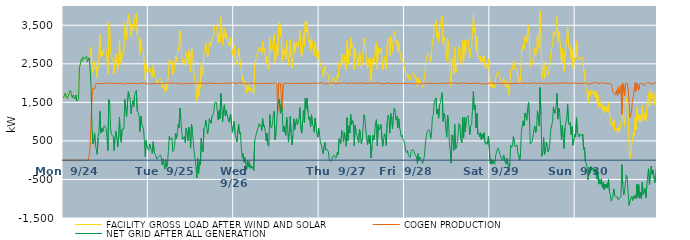
| Category | FACILITY GROSS LOAD AFTER WIND AND SOLAR | COGEN PRODUCTION | NET GRID AFTER ALL GENERATION |
|---|---|---|---|
|  Mon  9/24 | 1614 | 0 | 1614 |
|  Mon  9/24 | 1599 | 0 | 1599 |
|  Mon  9/24 | 1739 | 0 | 1739 |
|  Mon  9/24 | 1758 | 0 | 1758 |
|  Mon  9/24 | 1595 | 0 | 1595 |
|  Mon  9/24 | 1632 | 0 | 1632 |
|  Mon  9/24 | 1693 | 0 | 1693 |
|  Mon  9/24 | 1791 | 0 | 1791 |
|  Mon  9/24 | 1817 | 0 | 1817 |
|  Mon  9/24 | 1696 | 0 | 1696 |
|  Mon  9/24 | 1618 | 0 | 1618 |
|  Mon  9/24 | 1694 | 0 | 1694 |
|  Mon  9/24 | 1620 | 0 | 1620 |
|  Mon  9/24 | 1584 | 0 | 1584 |
|  Mon  9/24 | 1694 | 0 | 1694 |
|  Mon  9/24 | 1541 | 0 | 1541 |
|  Mon  9/24 | 1548 | 0 | 1548 |
|  Mon  9/24 | 1578 | 0 | 1578 |
|  Mon  9/24 | 2393 | 0 | 2393 |
|  Mon  9/24 | 2500 | 0 | 2500 |
|  Mon  9/24 | 2613 | 0 | 2613 |
|  Mon  9/24 | 2571 | 0 | 2571 |
|  Mon  9/24 | 2683 | 0 | 2683 |
|  Mon  9/24 | 2637 | 0 | 2637 |
|  Mon  9/24 | 2647 | 0 | 2647 |
|  Mon  9/24 | 2645 | 0 | 2645 |
|  Mon  9/24 | 2699 | 0 | 2699 |
|  Mon  9/24 | 2556 | 0 | 2556 |
|  Mon  9/24 | 2619 | 0 | 2619 |
|  Mon  9/24 | 2661 | 0 | 2661 |
|  Mon  9/24 | 2698 | 312 | 2386 |
|  Mon  9/24 | 2935 | 1019 | 1916 |
|  Mon  9/24 | 2478 | 1504 | 974 |
|  Mon  9/24 | 2279 | 1859 | 420 |
|  Mon  9/24 | 2424 | 1867 | 557 |
|  Mon  9/24 | 2553 | 1844 | 709 |
|  Mon  9/24 | 2377 | 1979 | 398 |
|  Mon  9/24 | 2426 | 2003 | 423 |
|  Mon  9/24 | 2143 | 1991 | 152 |
|  Mon  9/24 | 2583 | 1994 | 589 |
|  Mon  9/24 | 2735 | 1982 | 753 |
|  Mon  9/24 | 3267 | 1999 | 1268 |
|  Mon  9/24 | 2685 | 1983 | 702 |
|  Mon  9/24 | 2835 | 2002 | 833 |
|  Mon  9/24 | 2718 | 1985 | 733 |
|  Mon  9/24 | 2834 | 2009 | 825 |
|  Mon  9/24 | 2885 | 1989 | 896 |
|  Mon  9/24 | 2873 | 2010 | 863 |
|  Mon  9/24 | 2833 | 2008 | 825 |
|  Mon  9/24 | 2588 | 2001 | 587 |
|  Mon  9/24 | 2250 | 2002 | 248 |
|  Mon  9/24 | 3567 | 1993 | 1574 |
|  Mon  9/24 | 3489 | 1986 | 1503 |
|  Mon  9/24 | 2806 | 1990 | 816 |
|  Mon  9/24 | 2679 | 1998 | 681 |
|  Mon  9/24 | 2648 | 2007 | 641 |
|  Mon  9/24 | 2593 | 1985 | 608 |
|  Mon  9/24 | 2240 | 1990 | 250 |
|  Mon  9/24 | 2600 | 1994 | 606 |
|  Mon  9/24 | 2754 | 2005 | 749 |
|  Mon  9/24 | 2574 | 1995 | 579 |
|  Mon  9/24 | 2337 | 1998 | 339 |
|  Mon  9/24 | 2602 | 1986 | 616 |
|  Mon  9/24 | 3117 | 1995 | 1122 |
|  Mon  9/24 | 2581 | 2000 | 581 |
|  Mon  9/24 | 2470 | 2005 | 465 |
|  Mon  9/24 | 2786 | 1984 | 802 |
|  Mon  9/24 | 2794 | 1990 | 804 |
|  Mon  9/24 | 2778 | 1970 | 808 |
|  Mon  9/24 | 3570 | 1988 | 1582 |
|  Mon  9/24 | 3306 | 1997 | 1309 |
|  Mon  9/24 | 3129 | 1996 | 1133 |
|  Mon  9/24 | 3122 | 1994 | 1128 |
|  Mon  9/24 | 3785 | 2007 | 1778 |
|  Mon  9/24 | 3644 | 1988 | 1656 |
|  Mon  9/24 | 3600 | 1989 | 1611 |
|  Mon  9/24 | 3202 | 1997 | 1205 |
|  Mon  9/24 | 3429 | 2015 | 1414 |
|  Mon  9/24 | 3525 | 1986 | 1539 |
|  Mon  9/24 | 3372 | 1984 | 1388 |
|  Mon  9/24 | 3673 | 1989 | 1684 |
|  Mon  9/24 | 3737 | 1977 | 1760 |
|  Mon  9/24 | 3802 | 1992 | 1810 |
|  Mon  9/24 | 3257 | 1985 | 1272 |
|  Mon  9/24 | 3214 | 1978 | 1236 |
|  Mon  9/24 | 3147 | 1983 | 1164 |
|  Mon  9/24 | 2735 | 1994 | 741 |
|  Mon  9/24 | 3142 | 1998 | 1144 |
|  Mon  9/24 | 2928 | 1994 | 934 |
|  Mon  9/24 | 2951 | 1996 | 955 |
|  Mon  9/24 | 2817 | 2005 | 812 |
|  Mon  9/24 | 2507 | 1997 | 510 |
|  Mon  9/24 | 2082 | 1988 | 94 |
|  Mon  9/24 | 2493 | 1983 | 510 |
|  Mon  9/24 | 2326 | 1977 | 349 |
|  Mon  9/24 | 2270 | 1976 | 294 |
|  Tue  9/25 | 2253 | 1999 | 254 |
|  Tue  9/25 | 2418 | 1999 | 419 |
|  Tue  9/25 | 2293 | 1968 | 325 |
|  Tue  9/25 | 2255 | 1983 | 272 |
|  Tue  9/25 | 2162 | 1990 | 172 |
|  Tue  9/25 | 2464 | 1987 | 477 |
|  Tue  9/25 | 2213 | 1992 | 221 |
|  Tue  9/25 | 2149 | 1998 | 151 |
|  Tue  9/25 | 2100 | 1991 | 109 |
|  Tue  9/25 | 2010 | 1984 | 26 |
|  Tue  9/25 | 2016 | 1985 | 31 |
|  Tue  9/25 | 2070 | 1982 | 88 |
|  Tue  9/25 | 2072 | 1981 | 91 |
|  Tue  9/25 | 2122 | 1988 | 134 |
|  Tue  9/25 | 2059 | 1979 | 80 |
|  Tue  9/25 | 1875 | 2003 | -128 |
|  Tue  9/25 | 2025 | 1992 | 33 |
|  Tue  9/25 | 1911 | 2005 | -94 |
|  Tue  9/25 | 1763 | 1994 | -231 |
|  Tue  9/25 | 1989 | 1977 | 12 |
|  Tue  9/25 | 1820 | 2001 | -181 |
|  Tue  9/25 | 1883 | 1989 | -106 |
|  Tue  9/25 | 2233 | 2004 | 229 |
|  Tue  9/25 | 2627 | 2011 | 616 |
|  Tue  9/25 | 2522 | 1996 | 526 |
|  Tue  9/25 | 2495 | 1975 | 520 |
|  Tue  9/25 | 2587 | 1997 | 590 |
|  Tue  9/25 | 2227 | 2003 | 224 |
|  Tue  9/25 | 2256 | 1990 | 266 |
|  Tue  9/25 | 2371 | 2002 | 369 |
|  Tue  9/25 | 2719 | 2015 | 704 |
|  Tue  9/25 | 2557 | 1989 | 568 |
|  Tue  9/25 | 2672 | 1986 | 686 |
|  Tue  9/25 | 2920 | 1993 | 927 |
|  Tue  9/25 | 2837 | 2000 | 837 |
|  Tue  9/25 | 3354 | 2006 | 1348 |
|  Tue  9/25 | 3094 | 2007 | 1087 |
|  Tue  9/25 | 2715 | 1977 | 738 |
|  Tue  9/25 | 2524 | 1995 | 529 |
|  Tue  9/25 | 2519 | 1978 | 541 |
|  Tue  9/25 | 2622 | 2006 | 616 |
|  Tue  9/25 | 2448 | 1990 | 458 |
|  Tue  9/25 | 2806 | 1973 | 833 |
|  Tue  9/25 | 2734 | 1994 | 740 |
|  Tue  9/25 | 2494 | 1991 | 503 |
|  Tue  9/25 | 2860 | 2003 | 857 |
|  Tue  9/25 | 2673 | 1995 | 678 |
|  Tue  9/25 | 2299 | 1990 | 309 |
|  Tue  9/25 | 2919 | 1987 | 932 |
|  Tue  9/25 | 2781 | 1996 | 785 |
|  Tue  9/25 | 2461 | 1991 | 470 |
|  Tue  9/25 | 2216 | 1999 | 217 |
|  Tue  9/25 | 2035 | 1990 | 45 |
|  Tue  9/25 | 1831 | 1995 | -164 |
|  Tue  9/25 | 1540 | 2000 | -460 |
|  Tue  9/25 | 2046 | 1999 | 47 |
|  Tue  9/25 | 1645 | 1994 | -349 |
|  Tue  9/25 | 1964 | 1999 | -35 |
|  Tue  9/25 | 1866 | 1992 | -126 |
|  Tue  9/25 | 2548 | 1973 | 575 |
|  Tue  9/25 | 2270 | 2001 | 269 |
|  Tue  9/25 | 2228 | 2006 | 222 |
|  Tue  9/25 | 2807 | 1981 | 826 |
|  Tue  9/25 | 2864 | 2008 | 856 |
|  Tue  9/25 | 3046 | 2007 | 1039 |
|  Tue  9/25 | 2843 | 1959 | 884 |
|  Tue  9/25 | 2681 | 2002 | 679 |
|  Tue  9/25 | 2812 | 2008 | 804 |
|  Tue  9/25 | 3079 | 2005 | 1074 |
|  Tue  9/25 | 3088 | 1990 | 1098 |
|  Tue  9/25 | 2954 | 1997 | 957 |
|  Tue  9/25 | 3143 | 2011 | 1132 |
|  Tue  9/25 | 3167 | 1989 | 1178 |
|  Tue  9/25 | 3228 | 2000 | 1228 |
|  Tue  9/25 | 3475 | 1990 | 1485 |
|  Tue  9/25 | 3494 | 1988 | 1506 |
|  Tue  9/25 | 3491 | 1988 | 1503 |
|  Tue  9/25 | 3266 | 1992 | 1274 |
|  Tue  9/25 | 3037 | 1992 | 1045 |
|  Tue  9/25 | 3283 | 1997 | 1286 |
|  Tue  9/25 | 3066 | 1988 | 1078 |
|  Tue  9/25 | 3713 | 1986 | 1727 |
|  Tue  9/25 | 3378 | 1991 | 1387 |
|  Tue  9/25 | 2978 | 1981 | 997 |
|  Tue  9/25 | 3307 | 1985 | 1322 |
|  Tue  9/25 | 3427 | 1990 | 1437 |
|  Tue  9/25 | 3160 | 2003 | 1157 |
|  Tue  9/25 | 3288 | 1999 | 1289 |
|  Tue  9/25 | 3150 | 1983 | 1167 |
|  Tue  9/25 | 3166 | 2010 | 1156 |
|  Tue  9/25 | 2968 | 1981 | 987 |
|  Tue  9/25 | 3099 | 1970 | 1129 |
|  Tue  9/25 | 3183 | 1997 | 1186 |
|  Tue  9/25 | 2917 | 1996 | 921 |
|  Tue  9/25 | 2740 | 2017 | 723 |
|  Tue  9/25 | 2890 | 1995 | 895 |
|  Wed  9/26 | 2995 | 1990 | 1005 |
|  Wed  9/26 | 2664 | 1994 | 670 |
|  Wed  9/26 | 2583 | 1997 | 586 |
|  Wed  9/26 | 2467 | 1995 | 472 |
|  Wed  9/26 | 2474 | 1992 | 482 |
|  Wed  9/26 | 2911 | 1983 | 928 |
|  Wed  9/26 | 2706 | 2015 | 691 |
|  Wed  9/26 | 2724 | 2004 | 720 |
|  Wed  9/26 | 2339 | 2002 | 337 |
|  Wed  9/26 | 2069 | 1998 | 71 |
|  Wed  9/26 | 2171 | 2003 | 168 |
|  Wed  9/26 | 1938 | 1992 | -54 |
|  Wed  9/26 | 2056 | 1986 | 70 |
|  Wed  9/26 | 1908 | 2004 | -96 |
|  Wed  9/26 | 1736 | 1988 | -252 |
|  Wed  9/26 | 1987 | 1997 | -10 |
|  Wed  9/26 | 1794 | 1969 | -175 |
|  Wed  9/26 | 1959 | 1993 | -34 |
|  Wed  9/26 | 1793 | 2001 | -208 |
|  Wed  9/26 | 1867 | 2007 | -140 |
|  Wed  9/26 | 1782 | 1995 | -213 |
|  Wed  9/26 | 1811 | 1981 | -170 |
|  Wed  9/26 | 1723 | 2000 | -277 |
|  Wed  9/26 | 2497 | 2002 | 495 |
|  Wed  9/26 | 2576 | 1985 | 591 |
|  Wed  9/26 | 2700 | 1998 | 702 |
|  Wed  9/26 | 2755 | 1982 | 773 |
|  Wed  9/26 | 2777 | 1981 | 796 |
|  Wed  9/26 | 2937 | 1993 | 944 |
|  Wed  9/26 | 2885 | 2001 | 884 |
|  Wed  9/26 | 2899 | 1986 | 913 |
|  Wed  9/26 | 2749 | 1980 | 769 |
|  Wed  9/26 | 3075 | 1994 | 1081 |
|  Wed  9/26 | 2851 | 1989 | 862 |
|  Wed  9/26 | 2904 | 2005 | 899 |
|  Wed  9/26 | 2706 | 1977 | 729 |
|  Wed  9/26 | 2507 | 2007 | 500 |
|  Wed  9/26 | 2688 | 1989 | 699 |
|  Wed  9/26 | 2383 | 1986 | 397 |
|  Wed  9/26 | 2349 | 1993 | 356 |
|  Wed  9/26 | 3180 | 1999 | 1181 |
|  Wed  9/26 | 2895 | 2001 | 894 |
|  Wed  9/26 | 2816 | 1982 | 834 |
|  Wed  9/26 | 2943 | 1999 | 944 |
|  Wed  9/26 | 3162 | 2003 | 1159 |
|  Wed  9/26 | 3274 | 2007 | 1267 |
|  Wed  9/26 | 2530 | 2002 | 528 |
|  Wed  9/26 | 2671 | 1990 | 681 |
|  Wed  9/26 | 2996 | 1978 | 1018 |
|  Wed  9/26 | 2700 | 1260 | 1440 |
|  Wed  9/26 | 3520 | 1995 | 1525 |
|  Wed  9/26 | 3580 | 1993 | 1587 |
|  Wed  9/26 | 3209 | 1994 | 1215 |
|  Wed  9/26 | 3448 | 2008 | 1440 |
|  Wed  9/26 | 2548 | 1288 | 1260 |
|  Wed  9/26 | 2723 | 1979 | 744 |
|  Wed  9/26 | 2888 | 1999 | 889 |
|  Wed  9/26 | 2724 | 1991 | 733 |
|  Wed  9/26 | 2616 | 1976 | 640 |
|  Wed  9/26 | 3109 | 1998 | 1111 |
|  Wed  9/26 | 2930 | 1999 | 931 |
|  Wed  9/26 | 2452 | 1983 | 469 |
|  Wed  9/26 | 2725 | 2009 | 716 |
|  Wed  9/26 | 3131 | 1998 | 1133 |
|  Wed  9/26 | 2686 | 1983 | 703 |
|  Wed  9/26 | 2394 | 2001 | 393 |
|  Wed  9/26 | 2632 | 1984 | 648 |
|  Wed  9/26 | 3065 | 1990 | 1075 |
|  Wed  9/26 | 2771 | 1992 | 779 |
|  Wed  9/26 | 2963 | 2002 | 961 |
|  Wed  9/26 | 3069 | 1994 | 1075 |
|  Wed  9/26 | 2913 | 1990 | 923 |
|  Wed  9/26 | 2959 | 1988 | 971 |
|  Wed  9/26 | 3088 | 1991 | 1097 |
|  Wed  9/26 | 3366 | 2004 | 1362 |
|  Wed  9/26 | 2792 | 1985 | 807 |
|  Wed  9/26 | 2685 | 1986 | 699 |
|  Wed  9/26 | 2996 | 1990 | 1006 |
|  Wed  9/26 | 3292 | 1997 | 1295 |
|  Wed  9/26 | 2954 | 1981 | 973 |
|  Wed  9/26 | 3597 | 1987 | 1610 |
|  Wed  9/26 | 3327 | 1983 | 1344 |
|  Wed  9/26 | 3600 | 1997 | 1603 |
|  Wed  9/26 | 3263 | 2007 | 1256 |
|  Wed  9/26 | 3060 | 2002 | 1058 |
|  Wed  9/26 | 3110 | 1989 | 1121 |
|  Wed  9/26 | 2843 | 1978 | 865 |
|  Wed  9/26 | 3175 | 1995 | 1180 |
|  Wed  9/26 | 2942 | 2007 | 935 |
|  Wed  9/26 | 2864 | 1995 | 869 |
|  Wed  9/26 | 2716 | 1994 | 722 |
|  Wed  9/26 | 3077 | 1985 | 1092 |
|  Wed  9/26 | 2880 | 1987 | 893 |
|  Wed  9/26 | 2679 | 1987 | 692 |
|  Wed  9/26 | 2590 | 1998 | 592 |
|  Wed  9/26 | 2824 | 2001 | 823 |
|  Thu  9/27 | 2666 | 1994 | 672 |
|  Thu  9/27 | 2429 | 1981 | 448 |
|  Thu  9/27 | 2408 | 2012 | 396 |
|  Thu  9/27 | 2379 | 1990 | 389 |
|  Thu  9/27 | 2167 | 1997 | 170 |
|  Thu  9/27 | 2346 | 1991 | 355 |
|  Thu  9/27 | 2436 | 1971 | 465 |
|  Thu  9/27 | 2255 | 1994 | 261 |
|  Thu  9/27 | 2283 | 1994 | 289 |
|  Thu  9/27 | 2257 | 1997 | 260 |
|  Thu  9/27 | 2195 | 1983 | 212 |
|  Thu  9/27 | 2001 | 2007 | -6 |
|  Thu  9/27 | 2001 | 2002 | -1 |
|  Thu  9/27 | 1951 | 1977 | -26 |
|  Thu  9/27 | 2026 | 1992 | 34 |
|  Thu  9/27 | 2114 | 2003 | 111 |
|  Thu  9/27 | 2096 | 2002 | 94 |
|  Thu  9/27 | 2125 | 2002 | 123 |
|  Thu  9/27 | 2024 | 1977 | 47 |
|  Thu  9/27 | 2051 | 1976 | 75 |
|  Thu  9/27 | 2201 | 1995 | 206 |
|  Thu  9/27 | 2145 | 2007 | 138 |
|  Thu  9/27 | 2552 | 1998 | 554 |
|  Thu  9/27 | 2464 | 1974 | 490 |
|  Thu  9/27 | 2426 | 1988 | 438 |
|  Thu  9/27 | 2759 | 1988 | 771 |
|  Thu  9/27 | 2750 | 2007 | 743 |
|  Thu  9/27 | 2469 | 1998 | 471 |
|  Thu  9/27 | 2729 | 2013 | 716 |
|  Thu  9/27 | 2594 | 2004 | 590 |
|  Thu  9/27 | 2349 | 1989 | 360 |
|  Thu  9/27 | 3101 | 2000 | 1101 |
|  Thu  9/27 | 2490 | 1987 | 503 |
|  Thu  9/27 | 2877 | 1984 | 893 |
|  Thu  9/27 | 2709 | 2007 | 702 |
|  Thu  9/27 | 3178 | 1993 | 1185 |
|  Thu  9/27 | 2912 | 1994 | 918 |
|  Thu  9/27 | 3019 | 1990 | 1029 |
|  Thu  9/27 | 2984 | 1993 | 991 |
|  Thu  9/27 | 2352 | 1981 | 371 |
|  Thu  9/27 | 2900 | 1991 | 909 |
|  Thu  9/27 | 2759 | 1992 | 767 |
|  Thu  9/27 | 2657 | 2009 | 648 |
|  Thu  9/27 | 2659 | 2005 | 654 |
|  Thu  9/27 | 2443 | 1991 | 452 |
|  Thu  9/27 | 2814 | 2008 | 806 |
|  Thu  9/27 | 2646 | 2004 | 642 |
|  Thu  9/27 | 2408 | 1986 | 422 |
|  Thu  9/27 | 2560 | 2004 | 556 |
|  Thu  9/27 | 2834 | 1992 | 842 |
|  Thu  9/27 | 3164 | 1988 | 1176 |
|  Thu  9/27 | 3067 | 1994 | 1073 |
|  Thu  9/27 | 2796 | 1996 | 800 |
|  Thu  9/27 | 2537 | 1982 | 555 |
|  Thu  9/27 | 2380 | 1987 | 393 |
|  Thu  9/27 | 2638 | 1993 | 645 |
|  Thu  9/27 | 2437 | 1999 | 438 |
|  Thu  9/27 | 2630 | 1991 | 639 |
|  Thu  9/27 | 2057 | 2000 | 57 |
|  Thu  9/27 | 2378 | 1999 | 379 |
|  Thu  9/27 | 2644 | 2001 | 643 |
|  Thu  9/27 | 2524 | 2004 | 520 |
|  Thu  9/27 | 2701 | 1994 | 707 |
|  Thu  9/27 | 2960 | 1996 | 964 |
|  Thu  9/27 | 3054 | 2004 | 1050 |
|  Thu  9/27 | 2364 | 1995 | 369 |
|  Thu  9/27 | 2926 | 2006 | 920 |
|  Thu  9/27 | 2790 | 1997 | 793 |
|  Thu  9/27 | 2817 | 1983 | 834 |
|  Thu  9/27 | 2910 | 1980 | 930 |
|  Thu  9/27 | 2907 | 1984 | 923 |
|  Thu  9/27 | 2350 | 1988 | 362 |
|  Thu  9/27 | 2501 | 1991 | 510 |
|  Thu  9/27 | 2685 | 1999 | 686 |
|  Thu  9/27 | 2603 | 1978 | 625 |
|  Thu  9/27 | 2376 | 1994 | 382 |
|  Thu  9/27 | 2966 | 2002 | 964 |
|  Thu  9/27 | 3148 | 1985 | 1163 |
|  Thu  9/27 | 3105 | 2003 | 1102 |
|  Thu  9/27 | 2700 | 2000 | 700 |
|  Thu  9/27 | 3210 | 1988 | 1222 |
|  Thu  9/27 | 3056 | 1993 | 1063 |
|  Thu  9/27 | 2797 | 1987 | 810 |
|  Thu  9/27 | 3130 | 1990 | 1140 |
|  Thu  9/27 | 3344 | 1988 | 1356 |
|  Thu  9/27 | 3246 | 1992 | 1254 |
|  Thu  9/27 | 3033 | 1982 | 1051 |
|  Thu  9/27 | 3124 | 1983 | 1141 |
|  Thu  9/27 | 2826 | 1990 | 836 |
|  Thu  9/27 | 3062 | 1987 | 1075 |
|  Thu  9/27 | 2860 | 2002 | 858 |
|  Thu  9/27 | 2839 | 1976 | 863 |
|  Thu  9/27 | 2595 | 1984 | 611 |
|  Thu  9/27 | 2633 | 1983 | 650 |
|  Thu  9/27 | 2520 | 1994 | 526 |
|  Thu  9/27 | 2499 | 2001 | 498 |
|  Fri  9/28 | 2368 | 1976 | 392 |
|  Fri  9/28 | 2206 | 1981 | 225 |
|  Fri  9/28 | 2180 | 1985 | 195 |
|  Fri  9/28 | 2252 | 2000 | 252 |
|  Fri  9/28 | 2108 | 1993 | 115 |
|  Fri  9/28 | 2111 | 1992 | 119 |
|  Fri  9/28 | 2064 | 1991 | 73 |
|  Fri  9/28 | 2223 | 1995 | 228 |
|  Fri  9/28 | 2265 | 1992 | 273 |
|  Fri  9/28 | 2253 | 1983 | 270 |
|  Fri  9/28 | 2252 | 1993 | 259 |
|  Fri  9/28 | 2135 | 1973 | 162 |
|  Fri  9/28 | 2171 | 2004 | 167 |
|  Fri  9/28 | 2078 | 1989 | 89 |
|  Fri  9/28 | 1903 | 1990 | -87 |
|  Fri  9/28 | 2158 | 1988 | 170 |
|  Fri  9/28 | 1974 | 1976 | -2 |
|  Fri  9/28 | 2069 | 1991 | 78 |
|  Fri  9/28 | 2014 | 1988 | 26 |
|  Fri  9/28 | 2023 | 1993 | 30 |
|  Fri  9/28 | 1884 | 1971 | -87 |
|  Fri  9/28 | 2002 | 1999 | 3 |
|  Fri  9/28 | 2125 | 1993 | 132 |
|  Fri  9/28 | 2406 | 1994 | 412 |
|  Fri  9/28 | 2628 | 2018 | 610 |
|  Fri  9/28 | 2730 | 1985 | 745 |
|  Fri  9/28 | 2744 | 1990 | 754 |
|  Fri  9/28 | 2800 | 2005 | 795 |
|  Fri  9/28 | 2702 | 1972 | 730 |
|  Fri  9/28 | 2568 | 2004 | 564 |
|  Fri  9/28 | 2755 | 2009 | 746 |
|  Fri  9/28 | 3124 | 1989 | 1135 |
|  Fri  9/28 | 3175 | 2000 | 1175 |
|  Fri  9/28 | 3506 | 1982 | 1524 |
|  Fri  9/28 | 3534 | 2000 | 1534 |
|  Fri  9/28 | 3626 | 2009 | 1617 |
|  Fri  9/28 | 3178 | 1981 | 1197 |
|  Fri  9/28 | 3329 | 2006 | 1323 |
|  Fri  9/28 | 3081 | 1991 | 1090 |
|  Fri  9/28 | 3432 | 1994 | 1438 |
|  Fri  9/28 | 3501 | 2008 | 1493 |
|  Fri  9/28 | 3661 | 2003 | 1658 |
|  Fri  9/28 | 3739 | 1989 | 1750 |
|  Fri  9/28 | 3006 | 2000 | 1006 |
|  Fri  9/28 | 3198 | 1985 | 1213 |
|  Fri  9/28 | 3144 | 1991 | 1153 |
|  Fri  9/28 | 2824 | 1997 | 827 |
|  Fri  9/28 | 2572 | 1977 | 595 |
|  Fri  9/28 | 3163 | 1995 | 1168 |
|  Fri  9/28 | 2996 | 1990 | 1006 |
|  Fri  9/28 | 2461 | 2006 | 455 |
|  Fri  9/28 | 2230 | 1997 | 233 |
|  Fri  9/28 | 1922 | 2000 | -78 |
|  Fri  9/28 | 2643 | 1988 | 655 |
|  Fri  9/28 | 2562 | 1999 | 563 |
|  Fri  9/28 | 2233 | 1986 | 247 |
|  Fri  9/28 | 2937 | 2008 | 929 |
|  Fri  9/28 | 2278 | 1986 | 292 |
|  Fri  9/28 | 2324 | 1987 | 337 |
|  Fri  9/28 | 2457 | 1975 | 482 |
|  Fri  9/28 | 2709 | 1993 | 716 |
|  Fri  9/28 | 2952 | 2004 | 948 |
|  Fri  9/28 | 2858 | 1993 | 865 |
|  Fri  9/28 | 2498 | 1990 | 508 |
|  Fri  9/28 | 2464 | 2016 | 448 |
|  Fri  9/28 | 3102 | 1988 | 1114 |
|  Fri  9/28 | 2576 | 1999 | 577 |
|  Fri  9/28 | 3117 | 2000 | 1117 |
|  Fri  9/28 | 2735 | 2005 | 730 |
|  Fri  9/28 | 3091 | 2001 | 1090 |
|  Fri  9/28 | 3093 | 2003 | 1090 |
|  Fri  9/28 | 3141 | 1988 | 1153 |
|  Fri  9/28 | 2894 | 1994 | 900 |
|  Fri  9/28 | 2649 | 1986 | 663 |
|  Fri  9/28 | 2887 | 1994 | 893 |
|  Fri  9/28 | 2914 | 1991 | 923 |
|  Fri  9/28 | 3323 | 1989 | 1334 |
|  Fri  9/28 | 3782 | 2002 | 1780 |
|  Fri  9/28 | 3299 | 1996 | 1303 |
|  Fri  9/28 | 3420 | 1991 | 1429 |
|  Fri  9/28 | 2845 | 2005 | 840 |
|  Fri  9/28 | 3209 | 1997 | 1212 |
|  Fri  9/28 | 2677 | 1999 | 678 |
|  Fri  9/28 | 2706 | 1994 | 712 |
|  Fri  9/28 | 2598 | 1995 | 603 |
|  Fri  9/28 | 2698 | 1984 | 714 |
|  Fri  9/28 | 2515 | 1988 | 527 |
|  Fri  9/28 | 2646 | 1970 | 676 |
|  Fri  9/28 | 2552 | 1989 | 563 |
|  Fri  9/28 | 2706 | 1994 | 712 |
|  Fri  9/28 | 2442 | 1985 | 457 |
|  Fri  9/28 | 2382 | 1973 | 409 |
|  Fri  9/28 | 2464 | 1991 | 473 |
|  Fri  9/28 | 2406 | 1989 | 417 |
|  Fri  9/28 | 2624 | 1997 | 627 |
|  Fri  9/28 | 2641 | 1996 | 645 |
|  Sat  9/29 | 1916 | 2006 | -90 |
|  Sat  9/29 | 2034 | 2011 | 23 |
|  Sat  9/29 | 1888 | 1990 | -102 |
|  Sat  9/29 | 1995 | 1993 | 2 |
|  Sat  9/29 | 1903 | 1982 | -79 |
|  Sat  9/29 | 1869 | 1979 | -110 |
|  Sat  9/29 | 2112 | 2005 | 107 |
|  Sat  9/29 | 2203 | 2000 | 203 |
|  Sat  9/29 | 2275 | 1996 | 279 |
|  Sat  9/29 | 2305 | 1990 | 315 |
|  Sat  9/29 | 2207 | 1991 | 216 |
|  Sat  9/29 | 2134 | 1984 | 150 |
|  Sat  9/29 | 2065 | 1981 | 84 |
|  Sat  9/29 | 2071 | 2001 | 70 |
|  Sat  9/29 | 1981 | 1996 | -15 |
|  Sat  9/29 | 2109 | 1978 | 131 |
|  Sat  9/29 | 2123 | 1997 | 126 |
|  Sat  9/29 | 1941 | 1992 | -51 |
|  Sat  9/29 | 1885 | 1989 | -104 |
|  Sat  9/29 | 2043 | 1988 | 55 |
|  Sat  9/29 | 1877 | 1991 | -114 |
|  Sat  9/29 | 1691 | 2001 | -310 |
|  Sat  9/29 | 1906 | 1998 | -92 |
|  Sat  9/29 | 2349 | 1965 | 384 |
|  Sat  9/29 | 2333 | 1999 | 334 |
|  Sat  9/29 | 2354 | 1985 | 369 |
|  Sat  9/29 | 2597 | 1981 | 616 |
|  Sat  9/29 | 2455 | 1991 | 464 |
|  Sat  9/29 | 2345 | 1994 | 351 |
|  Sat  9/29 | 2350 | 1993 | 357 |
|  Sat  9/29 | 2382 | 1987 | 395 |
|  Sat  9/29 | 2175 | 1975 | 200 |
|  Sat  9/29 | 2171 | 1992 | 179 |
|  Sat  9/29 | 1986 | 1995 | -9 |
|  Sat  9/29 | 2172 | 1999 | 173 |
|  Sat  9/29 | 2750 | 1998 | 752 |
|  Sat  9/29 | 2768 | 1999 | 769 |
|  Sat  9/29 | 3005 | 1985 | 1020 |
|  Sat  9/29 | 2885 | 1997 | 888 |
|  Sat  9/29 | 3211 | 1986 | 1225 |
|  Sat  9/29 | 3152 | 1999 | 1153 |
|  Sat  9/29 | 3040 | 2005 | 1035 |
|  Sat  9/29 | 3334 | 1999 | 1335 |
|  Sat  9/29 | 3504 | 1995 | 1509 |
|  Sat  9/29 | 3149 | 1987 | 1162 |
|  Sat  9/29 | 2410 | 1990 | 420 |
|  Sat  9/29 | 2405 | 2007 | 398 |
|  Sat  9/29 | 2490 | 2009 | 481 |
|  Sat  9/29 | 2595 | 1992 | 603 |
|  Sat  9/29 | 2784 | 1988 | 796 |
|  Sat  9/29 | 2899 | 2013 | 886 |
|  Sat  9/29 | 2707 | 1993 | 714 |
|  Sat  9/29 | 2781 | 1996 | 785 |
|  Sat  9/29 | 3278 | 1999 | 1279 |
|  Sat  9/29 | 3050 | 1979 | 1071 |
|  Sat  9/29 | 2897 | 2005 | 892 |
|  Sat  9/29 | 3873 | 1989 | 1884 |
|  Sat  9/29 | 3191 | 1997 | 1194 |
|  Sat  9/29 | 2106 | 2004 | 102 |
|  Sat  9/29 | 2230 | 1996 | 234 |
|  Sat  9/29 | 2582 | 1988 | 594 |
|  Sat  9/29 | 2130 | 1983 | 147 |
|  Sat  9/29 | 2218 | 1981 | 237 |
|  Sat  9/29 | 2447 | 1972 | 475 |
|  Sat  9/29 | 2361 | 1999 | 362 |
|  Sat  9/29 | 2201 | 1983 | 218 |
|  Sat  9/29 | 2281 | 1994 | 287 |
|  Sat  9/29 | 2440 | 1997 | 443 |
|  Sat  9/29 | 2779 | 1982 | 797 |
|  Sat  9/29 | 2780 | 1984 | 796 |
|  Sat  9/29 | 2994 | 1995 | 999 |
|  Sat  9/29 | 3366 | 1982 | 1384 |
|  Sat  9/29 | 3251 | 2003 | 1248 |
|  Sat  9/29 | 3206 | 1995 | 1211 |
|  Sat  9/29 | 3383 | 1981 | 1402 |
|  Sat  9/29 | 3719 | 1987 | 1732 |
|  Sat  9/29 | 3063 | 1998 | 1065 |
|  Sat  9/29 | 3352 | 2000 | 1352 |
|  Sat  9/29 | 3238 | 1992 | 1246 |
|  Sat  9/29 | 2906 | 1993 | 913 |
|  Sat  9/29 | 2535 | 2005 | 530 |
|  Sat  9/29 | 2903 | 2001 | 902 |
|  Sat  9/29 | 2564 | 1998 | 566 |
|  Sat  9/29 | 2295 | 1995 | 300 |
|  Sat  9/29 | 2838 | 1996 | 842 |
|  Sat  9/29 | 2863 | 2000 | 863 |
|  Sat  9/29 | 3100 | 2005 | 1095 |
|  Sat  9/29 | 3455 | 1994 | 1461 |
|  Sat  9/29 | 2954 | 1992 | 962 |
|  Sat  9/29 | 2897 | 1986 | 911 |
|  Sat  9/29 | 2972 | 1999 | 973 |
|  Sat  9/29 | 2643 | 1983 | 660 |
|  Sat  9/29 | 2879 | 2005 | 874 |
|  Sat  9/29 | 2386 | 2000 | 386 |
|  Sat  9/29 | 2496 | 1993 | 503 |
|  Sat  9/29 | 2670 | 2002 | 668 |
|  Sun  9/30 | 2623 | 2012 | 611 |
|  Sun  9/30 | 3093 | 1988 | 1105 |
|  Sun  9/30 | 2700 | 1988 | 712 |
|  Sun  9/30 | 2661 | 2009 | 652 |
|  Sun  9/30 | 2599 | 1998 | 601 |
|  Sun  9/30 | 2667 | 1986 | 681 |
|  Sun  9/30 | 2678 | 1986 | 692 |
|  Sun  9/30 | 2624 | 1995 | 629 |
|  Sun  9/30 | 2668 | 1991 | 677 |
|  Sun  9/30 | 2266 | 1985 | 281 |
|  Sun  9/30 | 2327 | 1996 | 331 |
|  Sun  9/30 | 1947 | 1991 | -44 |
|  Sun  9/30 | 1937 | 2010 | -73 |
|  Sun  9/30 | 1758 | 1973 | -215 |
|  Sun  9/30 | 1492 | 1996 | -504 |
|  Sun  9/30 | 1798 | 1983 | -185 |
|  Sun  9/30 | 1642 | 1975 | -333 |
|  Sun  9/30 | 1807 | 1975 | -168 |
|  Sun  9/30 | 1741 | 2005 | -264 |
|  Sun  9/30 | 1795 | 1994 | -199 |
|  Sun  9/30 | 1708 | 2003 | -295 |
|  Sun  9/30 | 1783 | 2003 | -220 |
|  Sun  9/30 | 1646 | 2021 | -375 |
|  Sun  9/30 | 1772 | 1999 | -227 |
|  Sun  9/30 | 1515 | 2006 | -491 |
|  Sun  9/30 | 1684 | 1993 | -309 |
|  Sun  9/30 | 1368 | 1990 | -622 |
|  Sun  9/30 | 1491 | 1996 | -505 |
|  Sun  9/30 | 1381 | 2001 | -620 |
|  Sun  9/30 | 1524 | 2008 | -484 |
|  Sun  9/30 | 1305 | 2009 | -704 |
|  Sun  9/30 | 1415 | 1992 | -577 |
|  Sun  9/30 | 1232 | 2005 | -773 |
|  Sun  9/30 | 1398 | 2017 | -619 |
|  Sun  9/30 | 1263 | 1989 | -726 |
|  Sun  9/30 | 1376 | 1982 | -606 |
|  Sun  9/30 | 1265 | 1988 | -723 |
|  Sun  9/30 | 1490 | 1993 | -503 |
|  Sun  9/30 | 1181 | 1996 | -815 |
|  Sun  9/30 | 1099 | 1998 | -899 |
|  Sun  9/30 | 909 | 1974 | -1065 |
|  Sun  9/30 | 974 | 1988 | -1014 |
|  Sun  9/30 | 870 | 1776 | -906 |
|  Sun  9/30 | 1050 | 1796 | -746 |
|  Sun  9/30 | 770 | 1693 | -923 |
|  Sun  9/30 | 775 | 1729 | -954 |
|  Sun  9/30 | 834 | 1813 | -979 |
|  Sun  9/30 | 722 | 1673 | -951 |
|  Sun  9/30 | 864 | 1899 | -1035 |
|  Sun  9/30 | 728 | 1721 | -993 |
|  Sun  9/30 | 858 | 1834 | -976 |
|  Sun  9/30 | 994 | 1949 | -955 |
|  Sun  9/30 | 1076 | 1189 | -113 |
|  Sun  9/30 | 1356 | 1993 | -637 |
|  Sun  9/30 | 1086 | 1989 | -903 |
|  Sun  9/30 | 881 | 1680 | -799 |
|  Sun  9/30 | 1168 | 1989 | -821 |
|  Sun  9/30 | 1616 | 1997 | -381 |
|  Sun  9/30 | 1517 | 2000 | -483 |
|  Sun  9/30 | 1348 | 1852 | -504 |
|  Sun  9/30 | 390 | 1561 | -1171 |
|  Sun  9/30 | 44 | 1111 | -1067 |
|  Sun  9/30 | 172 | 1161 | -989 |
|  Sun  9/30 | 371 | 1311 | -940 |
|  Sun  9/30 | 550 | 1600 | -1050 |
|  Sun  9/30 | 718 | 1642 | -924 |
|  Sun  9/30 | 644 | 1639 | -995 |
|  Sun  9/30 | 1105 | 2015 | -910 |
|  Sun  9/30 | 794 | 1791 | -997 |
|  Sun  9/30 | 1376 | 1993 | -617 |
|  Sun  9/30 | 1025 | 1986 | -961 |
|  Sun  9/30 | 1187 | 1823 | -636 |
|  Sun  9/30 | 996 | 1985 | -989 |
|  Sun  9/30 | 1156 | 1988 | -832 |
|  Sun  9/30 | 985 | 1986 | -1001 |
|  Sun  9/30 | 1415 | 1985 | -570 |
|  Sun  9/30 | 1091 | 1985 | -894 |
|  Sun  9/30 | 1039 | 1931 | -892 |
|  Sun  9/30 | 1221 | 1962 | -741 |
|  Sun  9/30 | 1011 | 1988 | -977 |
|  Sun  9/30 | 1326 | 1991 | -665 |
|  Sun  9/30 | 1600 | 2011 | -411 |
|  Sun  9/30 | 1767 | 1987 | -220 |
|  Sun  9/30 | 1366 | 2004 | -638 |
|  Sun  9/30 | 1602 | 1983 | -381 |
|  Sun  9/30 | 1825 | 1977 | -152 |
|  Sun  9/30 | 1597 | 1964 | -367 |
|  Sun  9/30 | 1715 | 1975 | -260 |
|  Sun  9/30 | 1749 | 1995 | -246 |
|  Sun  9/30 | 1432 | 2014 | -582 |
|  Sun  9/30 | 1579 | 1996 | -417 |
|  Sun  9/30 | 1882 | 1995 | -113 |